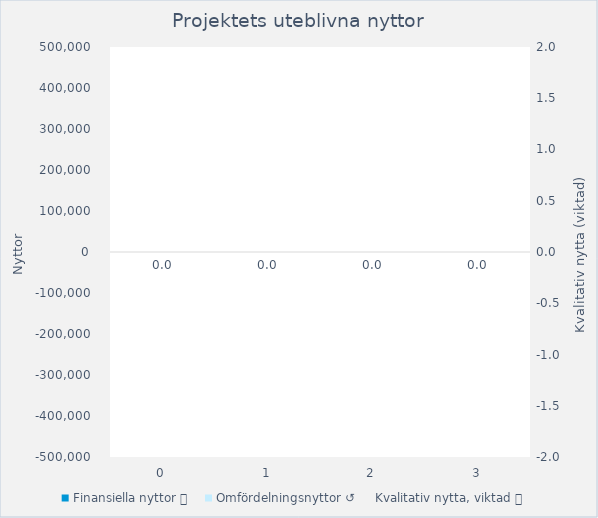
| Category | Finansiella nyttor 💰 | Omfördelningsnyttor ↺ |
|---|---|---|
| 0.0 | 0 | 0 |
| 1.0 | 0 | 0 |
| 2.0 | 0 | 0 |
| 3.0 | 0 | 0 |